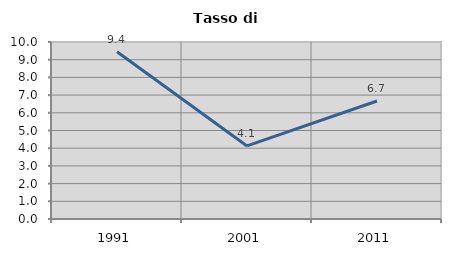
| Category | Tasso di disoccupazione   |
|---|---|
| 1991.0 | 9.447 |
| 2001.0 | 4.127 |
| 2011.0 | 6.667 |